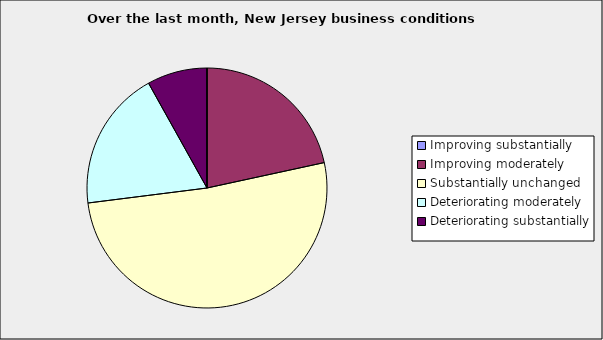
| Category | Series 0 |
|---|---|
| Improving substantially | 0 |
| Improving moderately | 0.216 |
| Substantially unchanged | 0.514 |
| Deteriorating moderately | 0.189 |
| Deteriorating substantially | 0.081 |